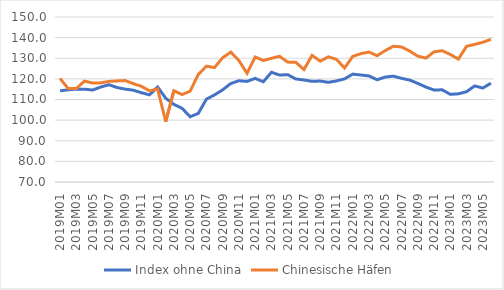
| Category | Index ohne China | Chinesische Häfen |
|---|---|---|
| 2019M01 | 114.213 | 120.184 |
| 2019M02 | 114.689 | 115.283 |
| 2019M03 | 115.027 | 115.274 |
| 2019M04 | 115.022 | 118.935 |
| 2019M05 | 114.586 | 117.996 |
| 2019M06 | 116.051 | 118.065 |
| 2019M07 | 117.158 | 118.76 |
| 2019M08 | 115.819 | 119.011 |
| 2019M09 | 115.043 | 119.176 |
| 2019M10 | 114.518 | 117.712 |
| 2019M11 | 113.292 | 116.41 |
| 2019M12 | 112.259 | 114.203 |
| 2020M01 | 116.052 | 115.101 |
| 2020M02 | 110.608 | 99.255 |
| 2020M03 | 107.64 | 114.264 |
| 2020M04 | 105.757 | 112.397 |
| 2020M05 | 101.63 | 114.021 |
| 2020M06 | 103.243 | 122.144 |
| 2020M07 | 110.158 | 126.145 |
| 2020M08 | 112.224 | 125.488 |
| 2020M09 | 114.694 | 130.245 |
| 2020M10 | 117.759 | 132.98 |
| 2020M11 | 119.085 | 128.88 |
| 2020M12 | 118.776 | 122.699 |
| 2021M01 | 120.244 | 130.614 |
| 2021M02 | 118.595 | 128.91 |
| 2021M03 | 123.197 | 129.969 |
| 2021M04 | 121.849 | 130.941 |
| 2021M05 | 122.04 | 128.137 |
| 2021M06 | 119.966 | 128.01 |
| 2021M07 | 119.461 | 124.508 |
| 2021M08 | 118.808 | 131.414 |
| 2021M09 | 118.955 | 128.595 |
| 2021M10 | 118.334 | 130.686 |
| 2021M11 | 119.005 | 129.46 |
| 2021M12 | 120.003 | 125.282 |
| 2022M01 | 122.297 | 130.9 |
| 2022M02 | 121.872 | 132.21 |
| 2022M03 | 121.435 | 132.998 |
| 2022M04 | 119.562 | 131.236 |
| 2022M05 | 120.881 | 133.726 |
| 2022M06 | 121.316 | 135.814 |
| 2022M07 | 120.266 | 135.476 |
| 2022M08 | 119.424 | 133.505 |
| 2022M09 | 117.818 | 131.014 |
| 2022M10 | 116.024 | 130.084 |
| 2022M11 | 114.612 | 133.107 |
| 2022M12 | 114.691 | 133.654 |
| 2023M01 | 112.504 | 131.83 |
| 2023M02 | 112.758 | 129.595 |
| 2023M03 | 113.777 | 135.803 |
| 2023M04 | 116.58 | 136.695 |
| 2023M05 | 115.549 | 137.754 |
| 2023M06 | 117.922 | 139.157 |